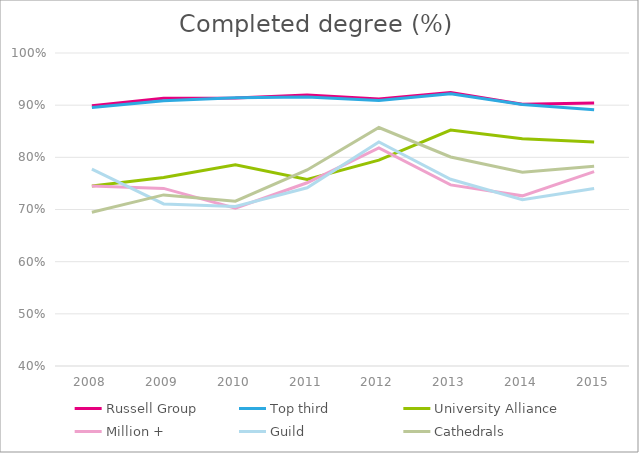
| Category | Russell Group | Top third | University Alliance | Million + | Guild | Cathedrals |
|---|---|---|---|---|---|---|
| 2008.0 | 0.899 | 0.895 | 0.745 | 0.745 | 0.777 | 0.695 |
| 2009.0 | 0.913 | 0.908 | 0.761 | 0.74 | 0.711 | 0.728 |
| 2010.0 | 0.914 | 0.914 | 0.786 | 0.703 | 0.706 | 0.716 |
| 2011.0 | 0.92 | 0.916 | 0.758 | 0.751 | 0.742 | 0.776 |
| 2012.0 | 0.912 | 0.909 | 0.795 | 0.818 | 0.829 | 0.857 |
| 2013.0 | 0.924 | 0.922 | 0.852 | 0.747 | 0.758 | 0.801 |
| 2014.0 | 0.902 | 0.901 | 0.836 | 0.726 | 0.719 | 0.772 |
| 2015.0 | 0.904 | 0.891 | 0.83 | 0.773 | 0.74 | 0.783 |